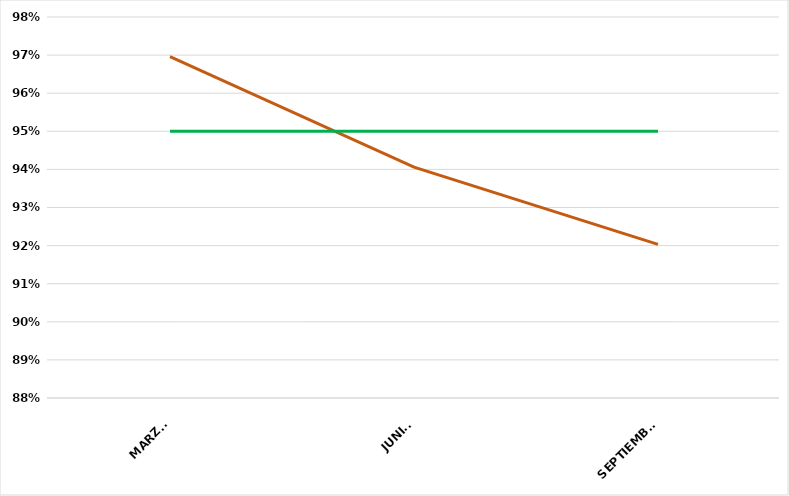
| Category | VALOR  | META PONDERADA |
|---|---|---|
| MARZO | 0.97 | 0.95 |
| JUNIO | 0.941 | 0.95 |
| SEPTIEMBRE | 0.92 | 0.95 |